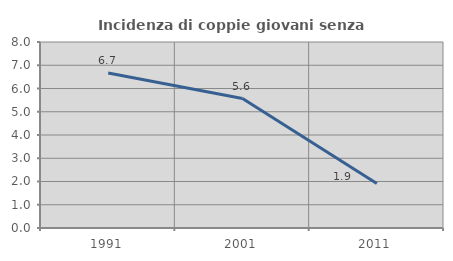
| Category | Incidenza di coppie giovani senza figli |
|---|---|
| 1991.0 | 6.67 |
| 2001.0 | 5.569 |
| 2011.0 | 1.91 |